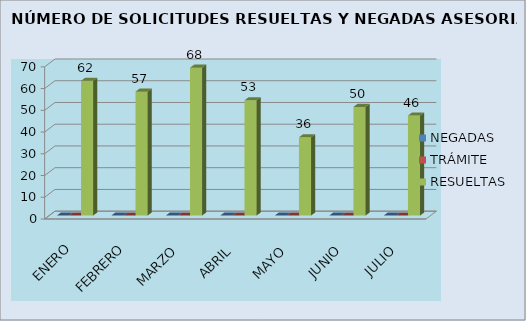
| Category | NEGADAS | TRÁMITE | RESUELTAS |
|---|---|---|---|
| ENERO | 0 | 0 | 62 |
| FEBRERO | 0 | 0 | 57 |
| MARZO | 0 | 0 | 68 |
| ABRIL | 0 | 0 | 53 |
| MAYO | 0 | 0 | 36 |
| JUNIO | 0 | 0 | 50 |
| JULIO | 0 | 0 | 46 |